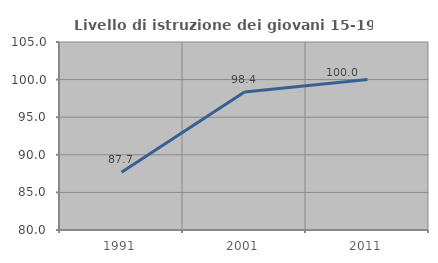
| Category | Livello di istruzione dei giovani 15-19 anni |
|---|---|
| 1991.0 | 87.671 |
| 2001.0 | 98.361 |
| 2011.0 | 100 |